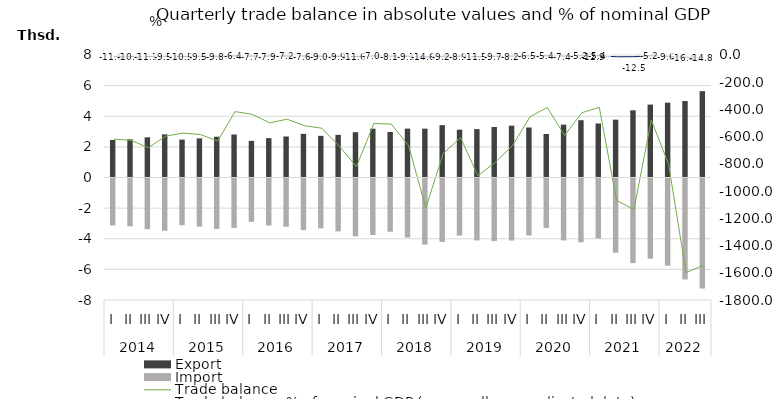
| Category | Export | Import |
|---|---|---|
| 0 | 2450.7 | -3068.8 |
| 1 | 2493.4 | -3120.5 |
| 2 | 2625.5 | -3306.5 |
| 3 | 2816.7 | -3413.2 |
| 4 | 2476.5 | -3050.1 |
| 5 | 2555.2 | -3139.2 |
| 6 | 2663.4 | -3295.5 |
| 7 | 2809.5 | -3225.4 |
| 8 | 2391.5 | -2828.1 |
| 9 | 2569.5 | -3068 |
| 10 | 2678.2 | -3149.9 |
| 11 | 2850.8 | -3370.5 |
| 12 | 2719.6 | -3257.4 |
| 13 | 2783.8 | -3452 |
| 14 | 2956.9 | -3777.4 |
| 15 | 3187 | -3690 |
| 16 | 2969.9 | -3477.4 |
| 17 | 3193.3 | -3857.4 |
| 18 | 3189.7 | -4313.9 |
| 19 | 3420.5 | -4144.2 |
| 20 | 3123.6 | -3730.2 |
| 21 | 3158.2 | -4044.8 |
| 22 | 3298.5 | -4087.5 |
| 23 | 3385.3 | -4051.1 |
| 24 | 3266.4 | -3720.9 |
| 25 | 2842.7 | -3228.3 |
| 26 | 3452.8 | -4043.7 |
| 27 | 3742.7 | -4166.6 |
| 28 | 3526.2 | -3910.7 |
| 29 | 3776 | -4844.9 |
| 30 | 4388.7 | -5523.8 |
| 31 | 4761.5 | -5239.5 |
| 32 | 4886.7 | -5690.3 |
| 33 | 4995.8 | -6594 |
| 34 | 5638.3 | -7183.9 |